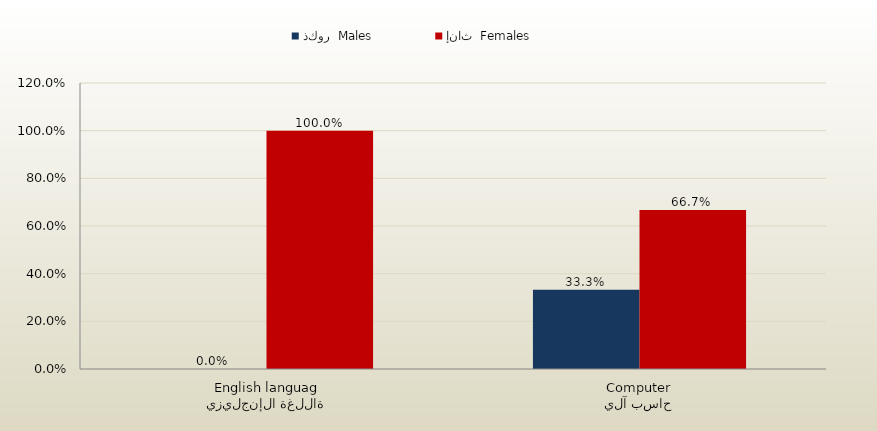
| Category | ذكور  Males | إناث  Females |
|---|---|---|
| اللغة الإنجليزية
English language | 0 | 1 |
| حاسب آلي
Computer | 0.333 | 0.667 |